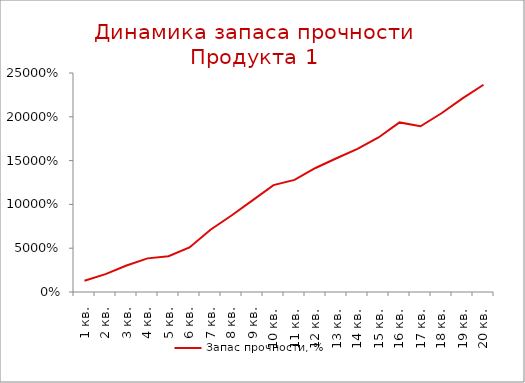
| Category | Запас прочности, % |
|---|---|
| 1 кв. | 12.807 |
| 2 кв. | 20.442 |
| 3 кв. | 30.282 |
| 4 кв. | 38.391 |
| 5 кв. | 40.799 |
| 6 кв. | 50.792 |
| 7 кв. | 71.043 |
| 8 кв. | 87.371 |
| 9 кв. | 104.618 |
| 10 кв. | 122.009 |
| 11 кв. | 127.949 |
| 12 кв. | 141.579 |
| 13 кв. | 152.692 |
| 14 кв. | 163.413 |
| 15 кв. | 176.379 |
| 16 кв. | 193.61 |
| 17 кв. | 189.165 |
| 18 кв. | 204.035 |
| 19 кв. | 221.065 |
| 20 кв. | 236.585 |